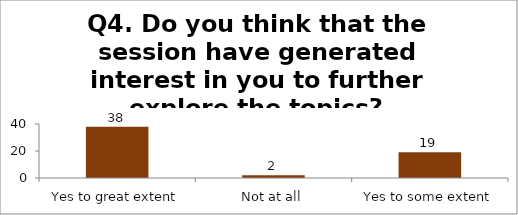
| Category | Q4. Do you think that the session have generated interest in you to further explore the topics? |
|---|---|
| Yes to great extent | 38 |
| Not at all | 2 |
| Yes to some extent | 19 |